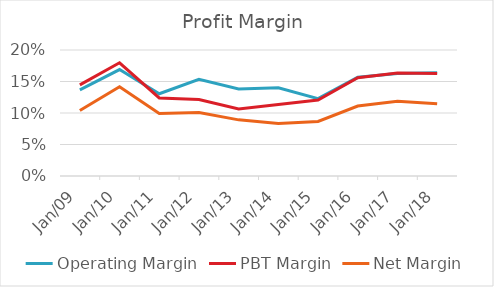
| Category | Operating Margin | PBT Margin | Net Margin |
|---|---|---|---|
| Mar-09 | 0.137 | 0.145 | 0.104 |
| Mar-10 | 0.169 | 0.18 | 0.142 |
| Mar-11 | 0.131 | 0.124 | 0.099 |
| Mar-12 | 0.153 | 0.121 | 0.101 |
| Mar-13 | 0.138 | 0.106 | 0.089 |
| Mar-14 | 0.14 | 0.113 | 0.083 |
| Mar-15 | 0.123 | 0.121 | 0.086 |
| Mar-16 | 0.157 | 0.156 | 0.111 |
| Mar-17 | 0.163 | 0.163 | 0.118 |
| Mar-18 | 0.164 | 0.163 | 0.115 |